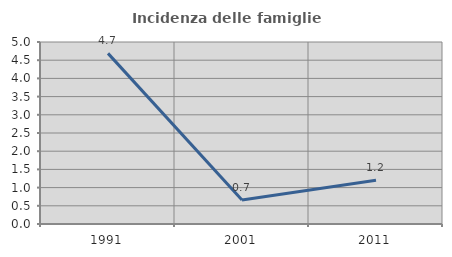
| Category | Incidenza delle famiglie numerose |
|---|---|
| 1991.0 | 4.688 |
| 2001.0 | 0.662 |
| 2011.0 | 1.205 |